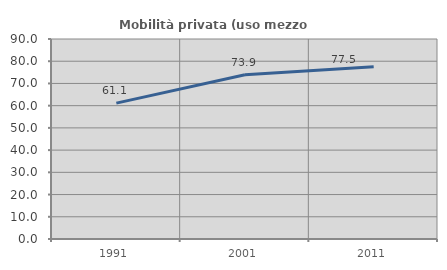
| Category | Mobilità privata (uso mezzo privato) |
|---|---|
| 1991.0 | 61.133 |
| 2001.0 | 73.91 |
| 2011.0 | 77.535 |